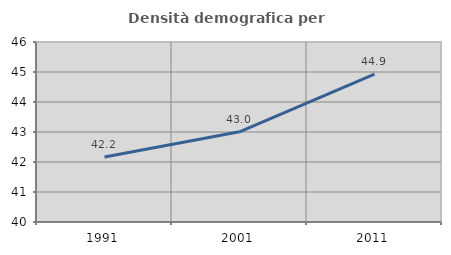
| Category | Densità demografica |
|---|---|
| 1991.0 | 42.168 |
| 2001.0 | 43.006 |
| 2011.0 | 44.927 |